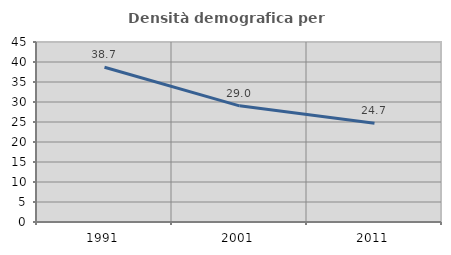
| Category | Densità demografica |
|---|---|
| 1991.0 | 38.693 |
| 2001.0 | 29.039 |
| 2011.0 | 24.671 |